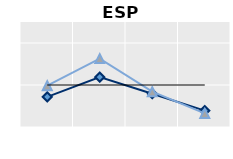
| Category | Foreign-born | Native-born | Series 1 |
|---|---|---|---|
| 15-24 | 0.718 | 0.983 | 1 |
| 25-54 | 1.188 | 1.628 | 1 |
| 55-64 | 0.79 | 0.84 | 1 |
| 65+ | 0.389 | 0.324 | 1 |